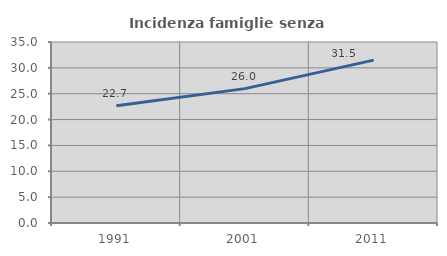
| Category | Incidenza famiglie senza nuclei |
|---|---|
| 1991.0 | 22.657 |
| 2001.0 | 25.983 |
| 2011.0 | 31.491 |